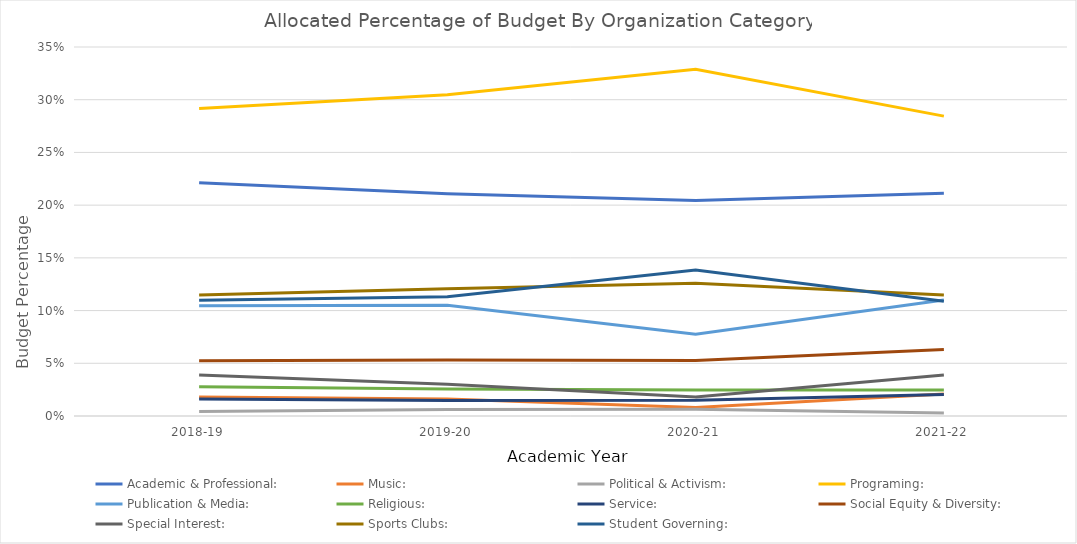
| Category | Academic & Professional: | Music: | Political & Activism: | Programing: | Publication & Media: | Religious: | Service: | Social Equity & Diversity: | Special Interest: | Sports Clubs: | Student Governing: |
|---|---|---|---|---|---|---|---|---|---|---|---|
| 2018-19 | 0.221 | 0.018 | 0.004 | 0.292 | 0.105 | 0.028 | 0.016 | 0.052 | 0.039 | 0.115 | 0.11 |
| 2019-20 | 0.211 | 0.016 | 0.006 | 0.305 | 0.105 | 0.026 | 0.015 | 0.053 | 0.03 | 0.121 | 0.113 |
| 2020-21 | 0.204 | 0.008 | 0.007 | 0.329 | 0.078 | 0.025 | 0.015 | 0.053 | 0.018 | 0.126 | 0.138 |
| 2021-22 | 0.211 | 0.021 | 0.003 | 0.284 | 0.11 | 0.025 | 0.02 | 0.063 | 0.039 | 0.115 | 0.109 |